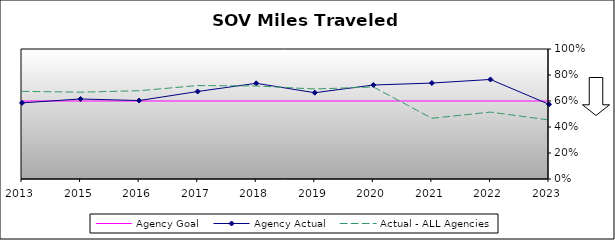
| Category | Agency Goal | Agency Actual | Actual - ALL Agencies |
|---|---|---|---|
| 2013.0 | 0.6 | 0.586 | 0.674 |
| 2015.0 | 0.6 | 0.616 | 0.668 |
| 2016.0 | 0.6 | 0.603 | 0.679 |
| 2017.0 | 0.6 | 0.673 | 0.719 |
| 2018.0 | 0.6 | 0.736 | 0.715 |
| 2019.0 | 0.6 | 0.664 | 0.692 |
| 2020.0 | 0.6 | 0.723 | 0.708 |
| 2021.0 | 0.6 | 0.738 | 0.467 |
| 2022.0 | 0.6 | 0.766 | 0.515 |
| 2023.0 | 0.6 | 0.574 | 0.454 |